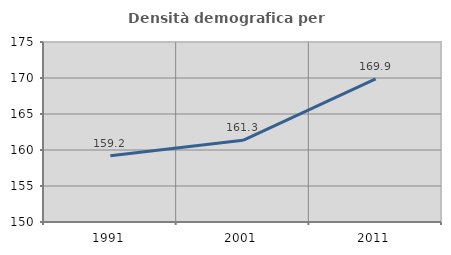
| Category | Densità demografica |
|---|---|
| 1991.0 | 159.199 |
| 2001.0 | 161.339 |
| 2011.0 | 169.878 |